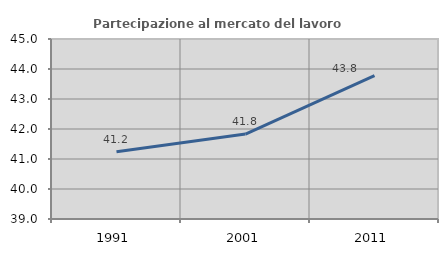
| Category | Partecipazione al mercato del lavoro  femminile |
|---|---|
| 1991.0 | 41.24 |
| 2001.0 | 41.83 |
| 2011.0 | 43.782 |